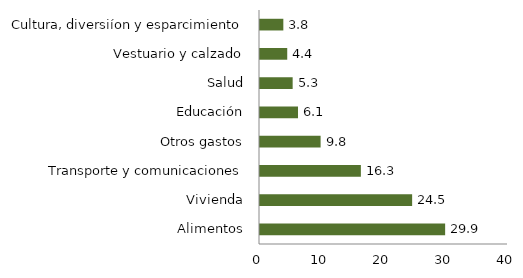
| Category | Series 0 |
|---|---|
| Alimentos | 29.862 |
| Vivienda | 24.538 |
| Transporte y comunicaciones | 16.271 |
| Otros gastos | 9.775 |
| Educación | 6.13 |
| Salud | 5.268 |
| Vestuario y calzado | 4.392 |
| Cultura, diversiíon y esparcimiento | 3.764 |